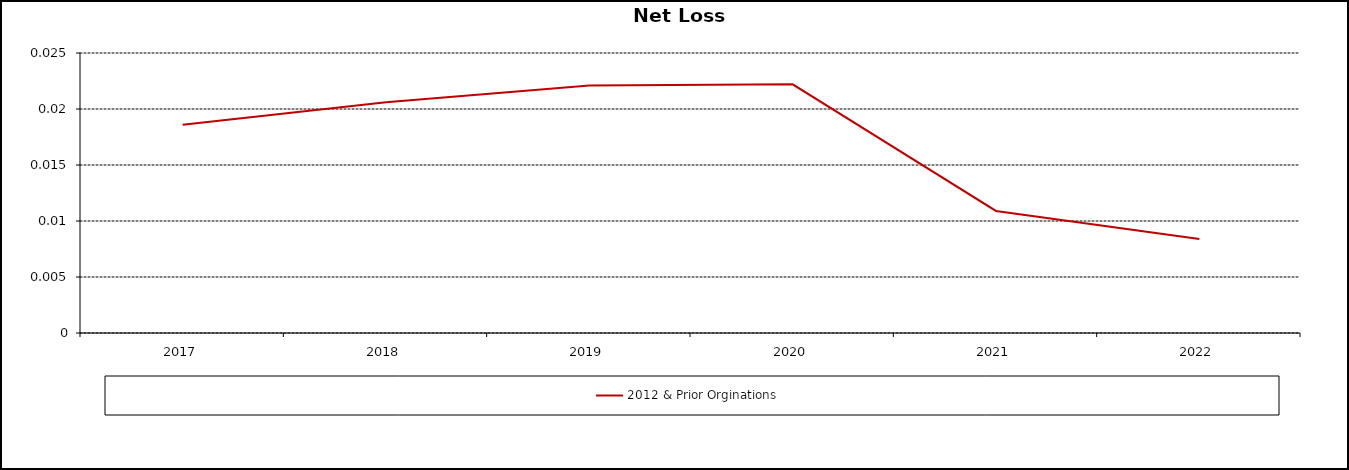
| Category | 2012 & Prior Orginations  |
|---|---|
| 2017.0 | 0.019 |
| 2018.0 | 0.021 |
| 2019.0 | 0.022 |
| 2020.0 | 0.022 |
| 2021.0 | 0.011 |
| 2022.0 | 0.008 |